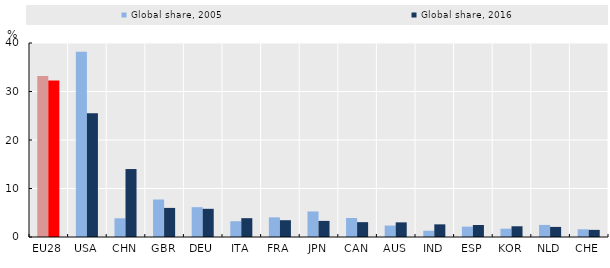
| Category | Global share, 2005 | Global share, 2016 |
|---|---|---|
| EU28 | 33.22 | 32.25 |
| USA | 38.19 | 25.53 |
| CHN | 3.86 | 14.01 |
| GBR | 7.73 | 6 |
| DEU | 6.15 | 5.81 |
| ITA | 3.25 | 3.88 |
| FRA | 4.05 | 3.46 |
| JPN | 5.26 | 3.32 |
| CAN | 3.92 | 3.06 |
| AUS | 2.36 | 3.02 |
| IND | 1.29 | 2.61 |
| ESP | 2.14 | 2.48 |
| KOR | 1.72 | 2.21 |
| NLD | 2.49 | 2.08 |
| CHE | 1.59 | 1.47 |